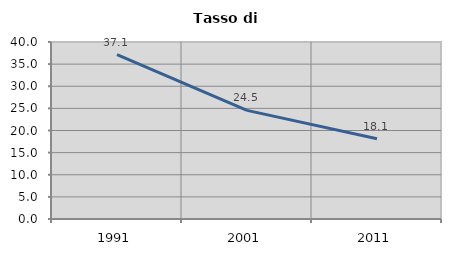
| Category | Tasso di disoccupazione   |
|---|---|
| 1991.0 | 37.137 |
| 2001.0 | 24.544 |
| 2011.0 | 18.144 |